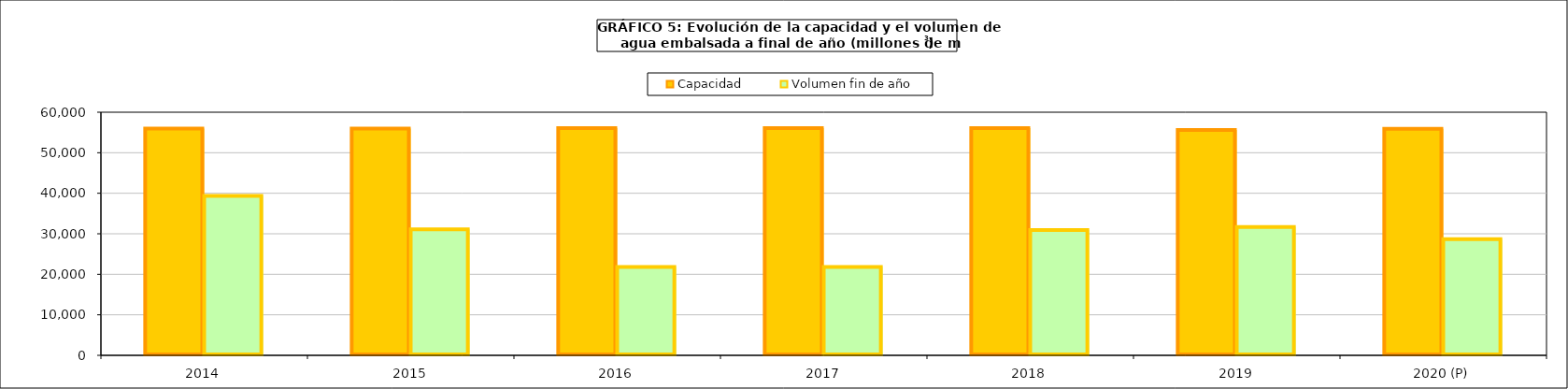
| Category | Capacidad | Volumen fin de año |
|---|---|---|
| 2014 | 55977 | 39350 |
| 2015 | 55977 | 31121 |
| 2016 | 56075 | 21832 |
| 2017 | 56074 | 21832 |
| 2018 | 56074 | 30936 |
| 2019 | 55622 | 31678 |
| 2020 (P) | 55899 | 28692 |